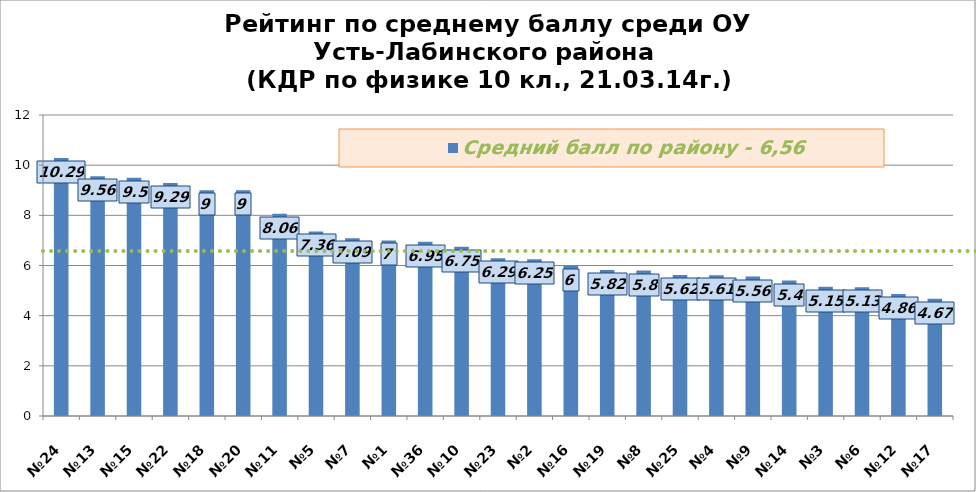
| Category | Средний балл по району - 6,56 |
|---|---|
| №24 | 10.29 |
| №13 | 9.56 |
| №15 | 9.5 |
| №22 | 9.29 |
| №18 | 9 |
| №20 | 9 |
| №11 | 8.06 |
| №5 | 7.36 |
| №7 | 7.09 |
| №1 | 7 |
| №36 | 6.95 |
| №10 | 6.75 |
| №23 | 6.29 |
| №2 | 6.25 |
| №16 | 6 |
| №19 | 5.82 |
| №8 | 5.8 |
| №25 | 5.62 |
| №4 | 5.61 |
| №9 | 5.56 |
| №14 | 5.4 |
| №3 | 5.15 |
| №6 | 5.13 |
| №12 | 4.86 |
| №17 | 4.67 |